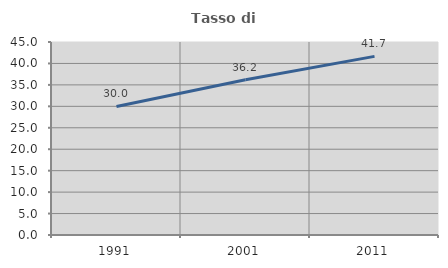
| Category | Tasso di occupazione   |
|---|---|
| 1991.0 | 29.981 |
| 2001.0 | 36.187 |
| 2011.0 | 41.651 |